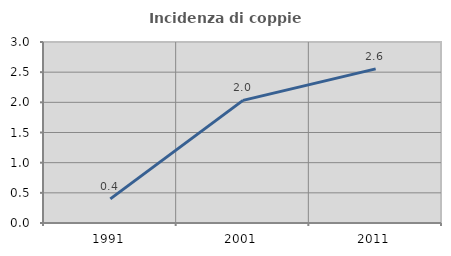
| Category | Incidenza di coppie miste |
|---|---|
| 1991.0 | 0.4 |
| 2001.0 | 2.033 |
| 2011.0 | 2.554 |